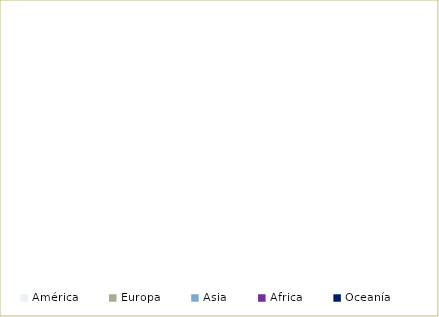
| Category | Series 0 |
|---|---|
| América | 0.95 |
| Europa | 0.045 |
| Asia | 0.003 |
| África | 0.001 |
| Oceanía | 0.001 |